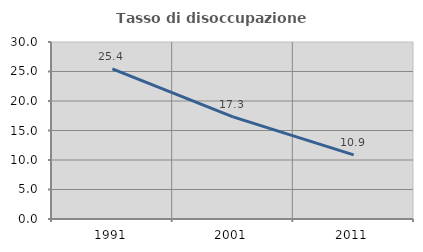
| Category | Tasso di disoccupazione giovanile  |
|---|---|
| 1991.0 | 25.444 |
| 2001.0 | 17.308 |
| 2011.0 | 10.87 |